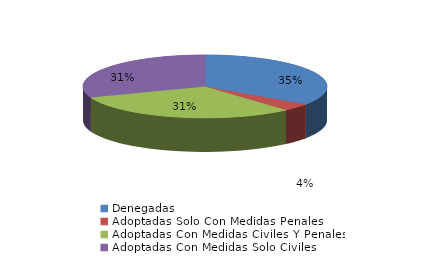
| Category | Series 0 |
|---|---|
| Denegadas | 9 |
| Adoptadas Solo Con Medidas Penales | 1 |
| Adoptadas Con Medidas Civiles Y Penales | 8 |
| Adoptadas Con Medidas Solo Civiles | 8 |